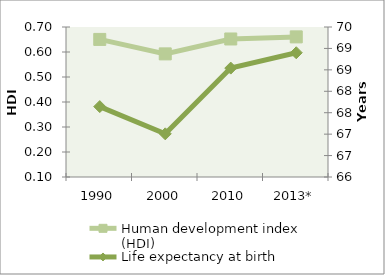
| Category | Human development index (HDI) |
|---|---|
| 1990 | 0.65 |
| 2000 | 0.592 |
| 2010 | 0.652 |
| 2013* | 0.66 |